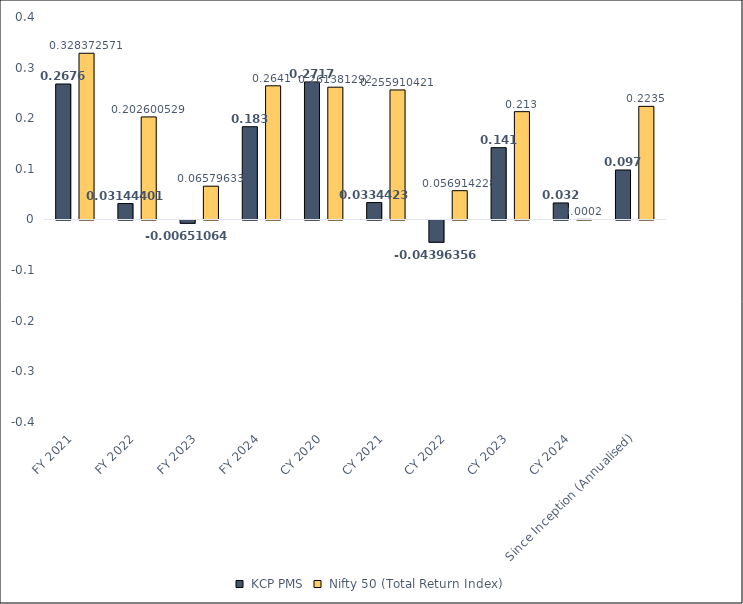
| Category | -0.04713 KCP PMS | -0.04713 Nifty 50 (Total Return Index) |
|---|---|---|
| FY 2021 | 0.268 | 0.328 |
| FY 2022 | 0.031 | 0.203 |
| FY 2023 | -0.007 | 0.066 |
| FY 2024 | 0.183 | 0.264 |
| CY 2020 | 0.272 | 0.261 |
| CY 2021 | 0.033 | 0.256 |
| CY 2022 | -0.044 | 0.057 |
| CY 2023 | 0.142 | 0.213 |
| CY 2024 | 0.033 | 0 |
| Since Inception (Annualised) | 0.098 | 0.224 |